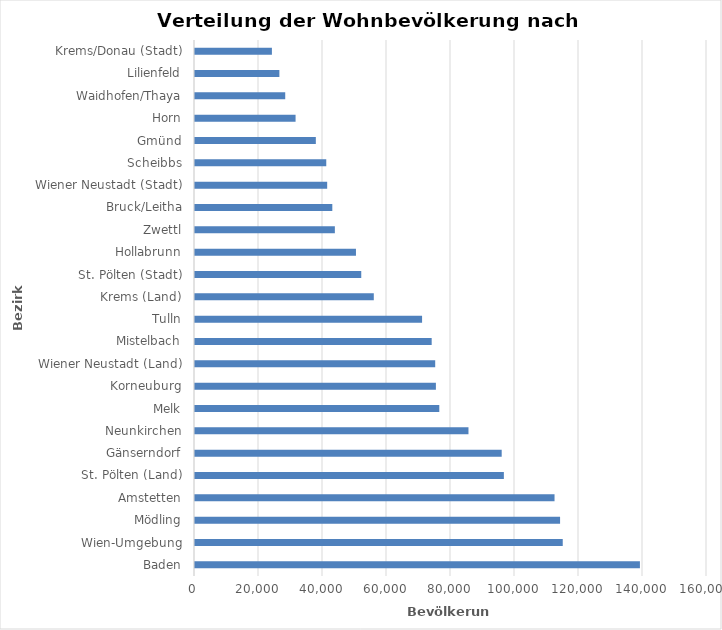
| Category | Wohnbevölkerung |
|---|---|
| Baden | 139039 |
| Wien-Umgebung | 114920 |
| Mödling | 114086 |
| Amstetten | 112355 |
| St. Pölten (Land) | 96522 |
| Gänserndorf | 95841 |
| Neunkirchen | 85460 |
| Melk | 76344 |
| Korneuburg | 75281 |
| Wiener Neustadt (Land) | 75064 |
| Mistelbach | 73962 |
| Tulln | 70963 |
| Krems (Land) | 55874 |
| St. Pölten (Stadt) | 51955 |
| Hollabrunn | 50301 |
| Zwettl | 43707 |
| Bruck/Leitha | 42910 |
| Wiener Neustadt (Stadt) | 41305 |
| Scheibbs | 41020 |
| Gmünd | 37761 |
| Horn | 31429 |
| Waidhofen/Thaya | 28197 |
| Lilienfeld | 26369 |
| Krems/Donau (Stadt) | 24032 |